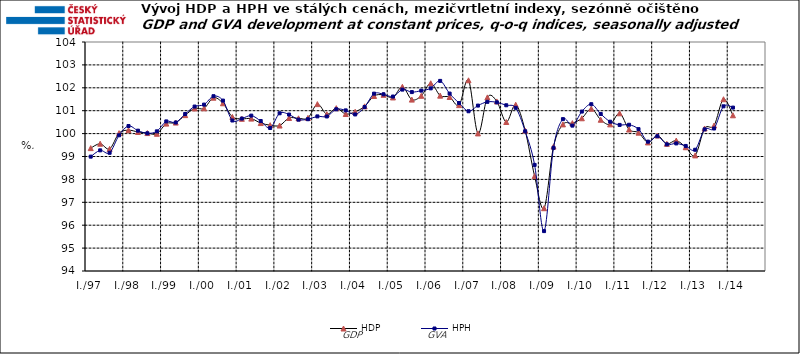
| Category | HDP

 | HPH

 |
|---|---|---|
| I./97 | 99.366 | 98.994 |
|  | 99.558 | 99.268 |
|  | 99.332 | 99.162 |
|  | 100.02 | 99.926 |
| I./98 | 100.15 | 100.331 |
|  | 100.071 | 100.128 |
|  | 100.023 | 100.014 |
|  | 99.993 | 100.098 |
| I./99 | 100.436 | 100.533 |
|  | 100.481 | 100.485 |
|  | 100.806 | 100.856 |
|  | 101.098 | 101.181 |
| I./00 | 101.105 | 101.266 |
|  | 101.569 | 101.633 |
|  | 101.324 | 101.442 |
|  | 100.728 | 100.572 |
| I./01 | 100.646 | 100.656 |
|  | 100.654 | 100.785 |
|  | 100.46 | 100.549 |
|  | 100.368 | 100.244 |
| I./02 | 100.352 | 100.888 |
|  | 100.682 | 100.832 |
|  | 100.668 | 100.61 |
|  | 100.686 | 100.628 |
| I./03 | 101.287 | 100.751 |
|  | 100.846 | 100.749 |
|  | 101.111 | 101.063 |
|  | 100.856 | 101.014 |
| I./04 | 100.953 | 100.836 |
|  | 101.19 | 101.159 |
|  | 101.643 | 101.745 |
|  | 101.695 | 101.716 |
| I./05 | 101.579 | 101.618 |
|  | 102.043 | 101.921 |
|  | 101.484 | 101.813 |
|  | 101.65 | 101.876 |
| I./06 | 102.198 | 101.976 |
|  | 101.658 | 102.301 |
|  | 101.598 | 101.747 |
|  | 101.244 | 101.335 |
| I./07 | 102.327 | 100.976 |
|  | 100.008 | 101.223 |
|  | 101.581 | 101.387 |
|  | 101.404 | 101.366 |
| I./08 | 100.506 | 101.237 |
|  | 101.26 | 101.126 |
|  | 100.132 | 100.103 |
|  | 98.143 | 98.633 |
| I./09 | 96.742 | 95.743 |
|  | 99.431 | 99.379 |
|  | 100.403 | 100.632 |
|  | 100.457 | 100.348 |
| I./10 | 100.669 | 100.962 |
|  | 101.085 | 101.283 |
|  | 100.605 | 100.859 |
|  | 100.403 | 100.52 |
| I./11 | 100.886 | 100.379 |
|  | 100.178 | 100.386 |
|  | 100.042 | 100.195 |
|  | 99.615 | 99.648 |
| I./12 | 99.917 | 99.886 |
|  | 99.553 | 99.532 |
|  | 99.696 | 99.57 |
|  | 99.405 | 99.461 |
| I./13 | 99.049 | 99.295 |
|  | 100.223 | 100.185 |
|  | 100.353 | 100.223 |
|  | 101.501 | 101.191 |
| I./14 | 100.799 | 101.135 |